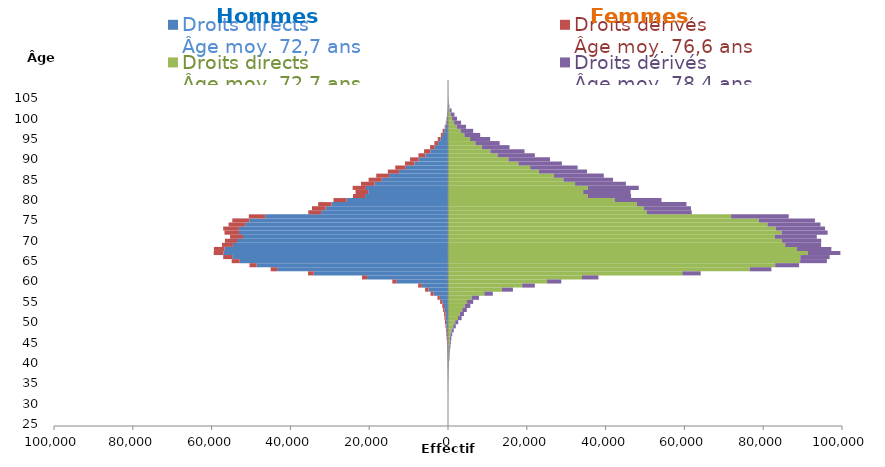
| Category | Droits directs
Âge moy. 72,7 ans | Droits dérivés
Âge moy. 76,6 ans | Droits dérivés
Âge moy. 78,4 ans |
|---|---|---|---|
| 25.0 | 0 | 0 | 0 |
| 26.0 | 0 | 0 | 0 |
| 27.0 | 1 | 0 | 1 |
| 28.0 | 1 | 0 | 2 |
| 29.0 | 1 | -2 | 0 |
| 30.0 | 2 | -2 | 6 |
| 31.0 | 4 | 0 | 8 |
| 32.0 | 9 | -2 | 9 |
| 33.0 | 12 | -4 | 20 |
| 34.0 | 29 | -9 | 29 |
| 35.0 | 21 | -18 | 32 |
| 36.0 | 56 | -17 | 47 |
| 37.0 | 67 | -14 | 48 |
| 38.0 | 92 | -21 | 66 |
| 39.0 | 126 | -32 | 87 |
| 40.0 | 141 | -37 | 113 |
| 41.0 | 214 | -46 | 150 |
| 42.0 | 221 | -70 | 180 |
| 43.0 | 271 | -62 | 195 |
| 44.0 | 322 | -95 | 284 |
| 45.0 | 395 | -116 | 323 |
| 46.0 | 484 | -126 | 346 |
| 47.0 | 634 | -150 | 430 |
| 48.0 | 948 | -193 | 505 |
| 49.0 | 1329 | -230 | 647 |
| 50.0 | 1833 | -291 | 765 |
| 51.0 | 2542 | -313 | 908 |
| 52.0 | 3015 | -352 | 1029 |
| 53.0 | 3615 | -417 | 1154 |
| 54.0 | 4260 | -448 | 1396 |
| 55.0 | 4831 | -548 | 1560 |
| 56.0 | 6004 | -593 | 1856 |
| 57.0 | 9210 | -760 | 2156 |
| 58.0 | 13696 | -876 | 2785 |
| 59.0 | 18833 | -922 | 3191 |
| 60.0 | 25145 | -1132 | 3613 |
| 61.0 | 34007 | -1280 | 4165 |
| 62.0 | 59441 | -1447 | 4690 |
| 63.0 | 76581 | -1638 | 5505 |
| 64.0 | 83032 | -1822 | 6075 |
| 65.0 | 89372 | -2046 | 6787 |
| 66.0 | 89419 | -2290 | 7449 |
| 67.0 | 91335 | -2498 | 8260 |
| 68.0 | 88551 | -2673 | 8739 |
| 69.0 | 85567 | -2768 | 9131 |
| 70.0 | 84739 | -3060 | 9985 |
| 71.0 | 82920 | -3289 | 10685 |
| 72.0 | 84659 | -3691 | 11693 |
| 73.0 | 83194 | -3993 | 12507 |
| 74.0 | 81074 | -4127 | 13463 |
| 75.0 | 78880 | -4292 | 14243 |
| 76.0 | 71848 | -4162 | 14632 |
| 77.0 | 50505 | -3249 | 11361 |
| 78.0 | 49699 | -3458 | 11966 |
| 79.0 | 47935 | -3431 | 12601 |
| 80.0 | 42290 | -3318 | 11889 |
| 81.0 | 35436 | -3066 | 11034 |
| 82.0 | 34304 | -3232 | 12036 |
| 83.0 | 35478 | -3370 | 12942 |
| 84.0 | 32252 | -3377 | 12913 |
| 85.0 | 29280 | -3353 | 12609 |
| 86.0 | 26871 | -3262 | 12668 |
| 87.0 | 23077 | -2845 | 12210 |
| 88.0 | 20852 | -2685 | 12049 |
| 89.0 | 17843 | -2398 | 11057 |
| 90.0 | 15334 | -2199 | 10555 |
| 91.0 | 12572 | -1773 | 9461 |
| 92.0 | 10743 | -1606 | 8673 |
| 93.0 | 8603 | -1172 | 7011 |
| 94.0 | 6937 | -945 | 6177 |
| 95.0 | 5599 | -707 | 5107 |
| 96.0 | 4137 | -509 | 4036 |
| 97.0 | 3182 | -409 | 3202 |
| 98.0 | 2228 | -244 | 2351 |
| 99.0 | 1555 | -165 | 1777 |
| 100.0 | 1037 | -103 | 1249 |
| 101.0 | 703 | -71 | 926 |
| 102.0 | 386 | -37 | 520 |
| 103.0 | 139 | -21 | 218 |
| 104.0 | 73 | -5 | 116 |
| 105.0 | 35 | -3 | 62 |
| 106.0 | 23 | -2 | 29 |
| 107.0 | 20 | 0 | 21 |
| 108.0 | 8 | 0 | 12 |
| 109.0 | 7 | 0 | 7 |